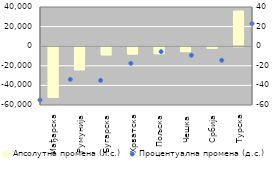
| Category | Апсолутна промена (л.с.) |
|---|---|
| Мађарска | -51813 |
| Румунија | -23614 |
| Бугарска | -8394 |
| Хрватска | -7452 |
| Пољска | -7164 |
| Чешка | -5048 |
| Србија | -1507 |
| Турска | 35915 |